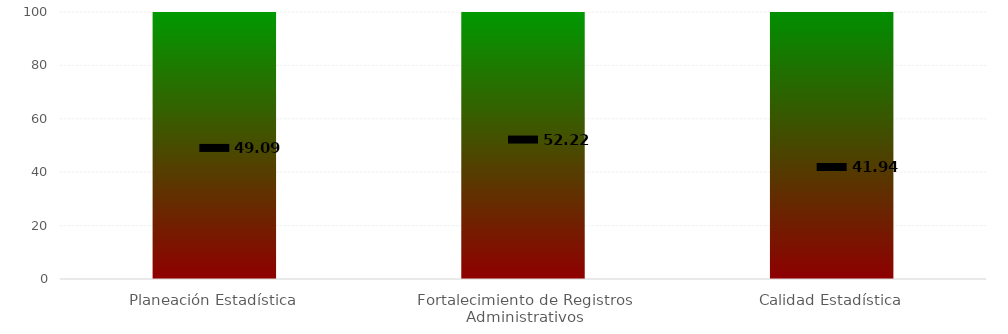
| Category | Nivel |
|---|---|
| Planeación Estadística | 100 |
| Fortalecimiento de Registros Administrativos | 100 |
| Calidad Estadística | 100 |